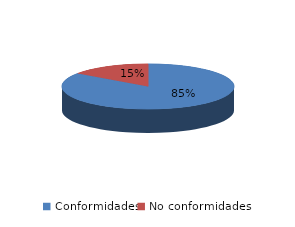
| Category | Series 0 |
|---|---|
| Conformidades | 1347 |
| No conformidades | 241 |